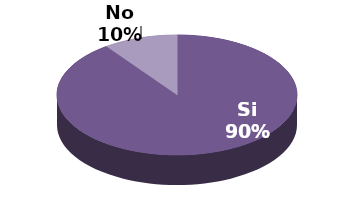
| Category | Series 1 |
|---|---|
| Si | 9 |
| No | 1 |